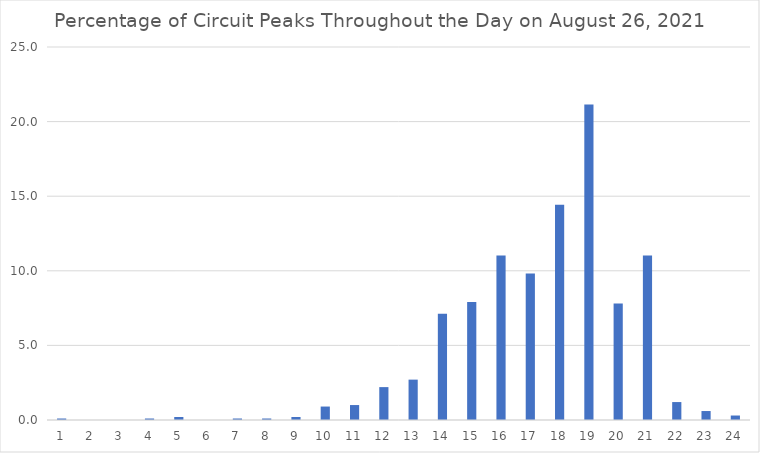
| Category | Series 0 |
|---|---|
| 0 | 0.1 |
| 1 | 0 |
| 2 | 0 |
| 3 | 0.1 |
| 4 | 0.2 |
| 5 | 0 |
| 6 | 0.1 |
| 7 | 0.1 |
| 8 | 0.2 |
| 9 | 0.902 |
| 10 | 1.002 |
| 11 | 2.204 |
| 12 | 2.705 |
| 13 | 7.114 |
| 14 | 7.916 |
| 15 | 11.022 |
| 16 | 9.82 |
| 17 | 14.429 |
| 18 | 21.142 |
| 19 | 7.816 |
| 20 | 11.022 |
| 21 | 1.202 |
| 22 | 0.601 |
| 23 | 0.301 |